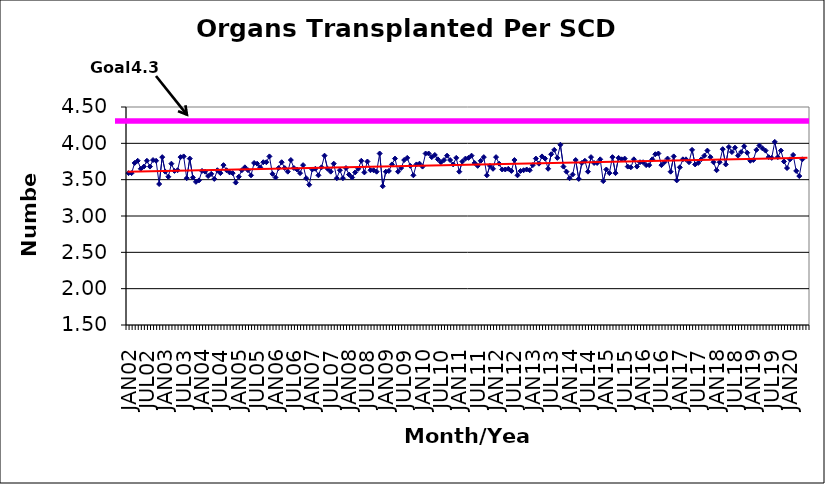
| Category | Series 0 |
|---|---|
| JAN02 | 3.59 |
| FEB02 | 3.59 |
| MAR02 | 3.73 |
| APR02 | 3.76 |
| MAY02 | 3.65 |
| JUN02 | 3.68 |
| JUL02 | 3.76 |
| AUG02 | 3.68 |
| SEP02 | 3.77 |
| OCT02 | 3.76 |
| NOV02 | 3.44 |
| DEC02 | 3.81 |
| JAN03 | 3.61 |
| FEB03 | 3.54 |
| MAR03 | 3.72 |
| APR03 | 3.62 |
| MAY03 | 3.63 |
| JUN03 | 3.81 |
| JUL03 | 3.82 |
| AUG03 | 3.52 |
| SEP03 | 3.79 |
| OCT03 | 3.53 |
| NOV03 | 3.47 |
| DEC03 | 3.49 |
| JAN04 | 3.62 |
| FEB04 | 3.61 |
| MAR04 | 3.55 |
| APR04 | 3.58 |
| MAY04 | 3.51 |
| JUN04 | 3.63 |
| JUL04 | 3.59 |
| AUG04 | 3.7 |
| SEP04 | 3.63 |
| OCT04 | 3.6 |
| NOV04 | 3.59 |
| DEC04 | 3.46 |
| JAN05 | 3.54 |
| FEB05 | 3.63 |
| MAR05 | 3.67 |
| APR05 | 3.63 |
| MAY05 | 3.56 |
| JUN05 | 3.73 |
| JUL05 | 3.72 |
| AUG05 | 3.67 |
| SEP05 | 3.74 |
| OCT05 | 3.74 |
| NOV05 | 3.82 |
| DEC05 | 3.58 |
| JAN06 | 3.53 |
| FEB06 | 3.66 |
| MAR06 | 3.74 |
| APR06 | 3.66 |
| MAY06 | 3.61 |
| JUN06 | 3.77 |
| JUL06 | 3.66 |
| AUG06 | 3.64 |
| SEP06 | 3.59 |
| OCT06 | 3.7 |
| NOV06 | 3.52 |
| DEC06 | 3.43 |
| JAN07 | 3.64 |
| FEB07 | 3.65 |
| MAR07 | 3.56 |
| APR07 | 3.67 |
| MAY07 | 3.83 |
| JUN07 | 3.65 |
| JUL07 | 3.61 |
| AUG07 | 3.72 |
| SEP07 | 3.52 |
| OCT07 | 3.63 |
| NOV07 | 3.52 |
| DEC07 | 3.66 |
| JAN08 | 3.57 |
| FEB08 | 3.53 |
| MAR08 | 3.6 |
| APR08 | 3.65 |
| MAY08 | 3.76 |
| JUN08 | 3.6 |
| JUL08 | 3.75 |
| AUG08 | 3.63 |
| SEP08 | 3.63 |
| OCT08 | 3.61 |
| NOV08 | 3.86 |
| DEC08 | 3.41 |
| JAN09 | 3.61 |
| FEB09 | 3.62 |
| MAR09 | 3.71 |
| APR09 | 3.79 |
| MAY09 | 3.61 |
| JUN09 | 3.66 |
| JUL09 | 3.77 |
| AUG09 | 3.8 |
| SEP09 | 3.69 |
| OCT09 | 3.56 |
| NOV09 | 3.71 |
| DEC09 | 3.72 |
| JAN10 | 3.68 |
| FEB10 | 3.86 |
| MAR10 | 3.86 |
| APR10 | 3.81 |
| MAY10 | 3.84 |
| JUN10 | 3.78 |
| JUL10 | 3.74 |
| AUG10 | 3.77 |
| SEP10 | 3.83 |
| OCT10 | 3.77 |
| NOV10 | 3.71 |
| DEC10 | 3.8 |
| JAN11 | 3.61 |
| FEB11 | 3.75 |
| MAR11 | 3.79 |
| APR11 | 3.8 |
| MAY11 | 3.83 |
| JUN11 | 3.73 |
| JUL11 | 3.69 |
| AUG11 | 3.76 |
| SEP11 | 3.81 |
| OCT11 | 3.56 |
| NOV11 | 3.69 |
| DEC11 | 3.65 |
| JAN12 | 3.81 |
| FEB12 | 3.72 |
| MAR12 | 3.64 |
| APR12 | 3.64 |
| MAY12 | 3.65 |
| JUN12 | 3.62 |
| JUL12 | 3.77 |
| AUG12 | 3.56 |
| SEP12 | 3.62 |
| OCT12 | 3.63 |
| NOV12 | 3.64 |
| DEC12 | 3.63 |
| JAN13 | 3.7 |
| FEB13 | 3.79 |
| MAR13 | 3.72 |
| APR13 | 3.82 |
| MAY13 | 3.79 |
| JUN13 | 3.65 |
| JUL13 | 3.85 |
| AUG13 | 3.91 |
| SEP13 | 3.8 |
| OCT13 | 3.98 |
| NOV13 | 3.68 |
| DEC13 | 3.61 |
| JAN14 | 3.52 |
| FEB14 | 3.57 |
| MAR14 | 3.77 |
| APR14 | 3.51 |
| MAY14 | 3.73 |
| JUN14 | 3.76 |
| JUL14 | 3.61 |
| AUG14 | 3.81 |
| SEP14 | 3.73 |
| OCT14 | 3.73 |
| NOV14 | 3.78 |
| DEC14 | 3.48 |
| JAN15 | 3.64 |
| FEB15 | 3.59 |
| MAR15 | 3.81 |
| APR15 | 3.59 |
| MAY15 | 3.8 |
| JUN15 | 3.78 |
| JUL15 | 3.79 |
| AUG15 | 3.68 |
| SEP15 | 3.67 |
| OCT15 | 3.78 |
| NOV15 | 3.68 |
| DEC15 | 3.74 |
| JAN16 | 3.74 |
| FEB16 | 3.7 |
| MAR16 | 3.7 |
| APR16 | 3.78 |
| MAY16 | 3.85 |
| JUN16 | 3.86 |
| JUL16 | 3.7 |
| AUG16 | 3.74 |
| SEP16 | 3.79 |
| OCT16 | 3.61 |
| NOV16 | 3.82 |
| DEC16 | 3.49 |
| JAN17 | 3.67 |
| FEB17 | 3.78 |
| MAR17 | 3.78 |
| APR17 | 3.74 |
| MAY17 | 3.91 |
| JUN17 | 3.71 |
| JUL17 | 3.73 |
| AUG17 | 3.78 |
| SEP17 | 3.83 |
| OCT17 | 3.9 |
| NOV17 | 3.81 |
| DEC17 | 3.74 |
| JAN18 | 3.63 |
| FEB18 | 3.74 |
| MAR18 | 3.92 |
| APR18 | 3.71 |
| MAY18 | 3.95 |
| JUN18 | 3.88 |
| JUL18 | 3.94 |
| AUG18 | 3.83 |
| SEP18 | 3.88 |
| OCT18 | 3.96 |
| NOV18 | 3.87 |
| DEC18 | 3.76 |
| JAN19 | 3.77 |
| FEB19 | 3.91 |
| MAR19 | 3.97 |
| APR19 | 3.93 |
| MAY19 | 3.9 |
| JUN19 | 3.81 |
| JUL19 | 3.8 |
| AUG19 | 4.02 |
| SEP19 | 3.81 |
| OCT19 | 3.9 |
| NOV19 | 3.75 |
| DEC19 | 3.66 |
| JAN20 | 3.78 |
| FEB20 | 3.84 |
| MAR20 | 3.62 |
| APR20 | 3.55 |
| MAY20 | 3.78 |